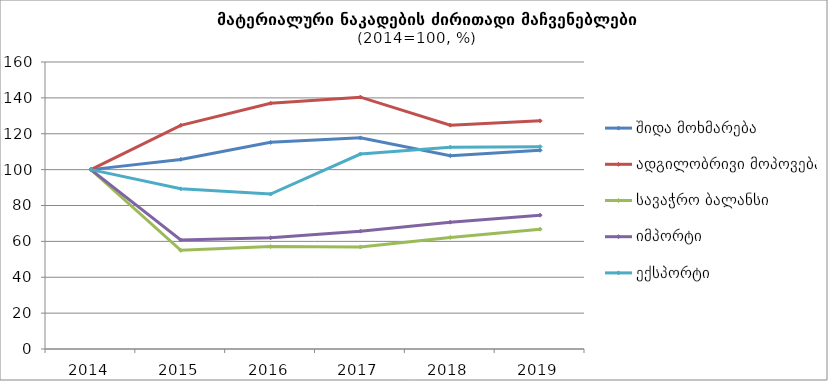
| Category | შიდა მოხმარება | ადგილობრივი მოპოვება | სავაჭრო ბალანსი | იმპორტი | ექსპორტი |
|---|---|---|---|---|---|
| 2014.0 | 100 | 100 | 100 | 100 | 100 |
| 2015.0 | 105.7 | 124.7 | 55 | 60.8 | 89.3 |
| 2016.0 | 115.2 | 137 | 57.1 | 62 | 86.4 |
| 2017.0 | 117.7 | 140.4 | 56.9 | 65.7 | 108.7 |
| 2018.0 | 107.8 | 124.8 | 62.2 | 70.7 | 112.5 |
| 2019.0 | 110.8 | 127.2 | 66.8 | 74.6 | 112.8 |